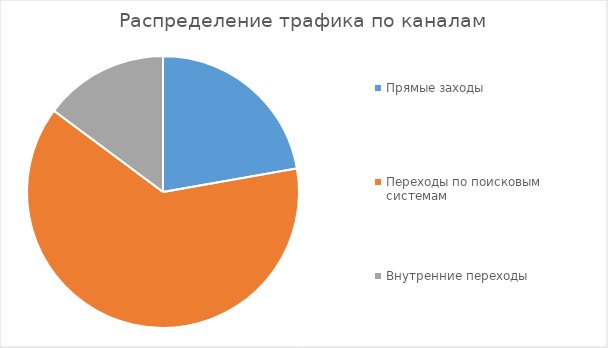
| Category | Series 0 |
|---|---|
| Прямые заходы | 6 |
| Переходы по поисковым системам | 17 |
| Внутренние переходы | 4 |